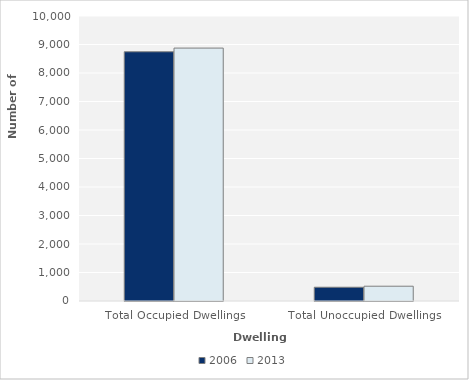
| Category | 2006 | 2013 |
|---|---|---|
| Total Occupied Dwellings | 8745 | 8874 |
| Total Unoccupied Dwellings | 483 | 519 |